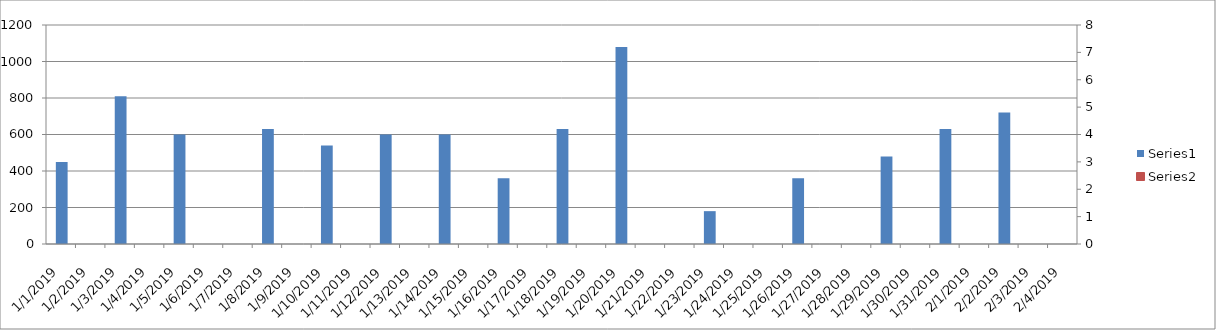
| Category | Series 0 |
|---|---|
| 1/1/19 | 450 |
| 1/2/19 | 0 |
| 1/3/19 | 810 |
| 1/4/19 | 0 |
| 1/5/19 | 600 |
| 1/6/19 | 0 |
| 1/7/19 | 0 |
| 1/8/19 | 630 |
| 1/9/19 | 0 |
| 1/10/19 | 540 |
| 1/11/19 | 0 |
| 1/12/19 | 600 |
| 1/13/19 | 0 |
| 1/14/19 | 600 |
| 1/15/19 | 0 |
| 1/16/19 | 360 |
| 1/17/19 | 0 |
| 1/18/19 | 630 |
| 1/19/19 | 0 |
| 1/20/19 | 1080 |
| 1/21/19 | 0 |
| 1/22/19 | 0 |
| 1/23/19 | 180 |
| 1/24/19 | 0 |
| 1/25/19 | 0 |
| 1/26/19 | 360 |
| 1/27/19 | 0 |
| 1/28/19 | 0 |
| 1/29/19 | 480 |
| 1/30/19 | 0 |
| 1/31/19 | 630 |
| 2/1/19 | 0 |
| 2/2/19 | 720 |
| 2/3/19 | 0 |
| 2/4/19 | 0 |